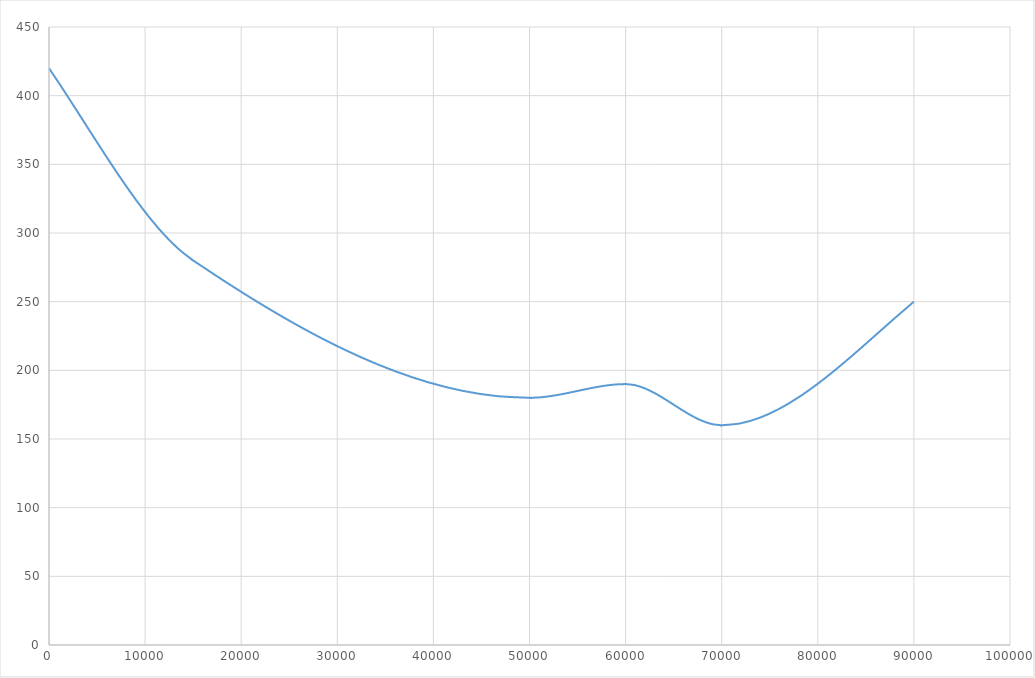
| Category | Series 0 |
|---|---|
| 0.0 | 420 |
| 1500.0 | 404.209 |
| 3000.0 | 387.935 |
| 4500.000000000001 | 371.51 |
| 6000.0 | 355.262 |
| 7500.0 | 339.523 |
| 9000.0 | 324.621 |
| 10500.0 | 310.888 |
| 11999.999999999998 | 298.654 |
| 13499.999999999998 | 288.248 |
| 14999.999999999998 | 280 |
| 15000.0 | 280 |
| 18500.0 | 263.86 |
| 22000.0 | 248.52 |
| 25500.0 | 234.191 |
| 29000.0 | 221.085 |
| 32500.0 | 209.414 |
| 36000.0 | 199.39 |
| 39500.0 | 191.225 |
| 43000.0 | 185.13 |
| 46500.0 | 181.318 |
| 49999.99999999999 | 180 |
| 50000.0 | 180 |
| 51000.0 | 180.28 |
| 52000.0 | 181.04 |
| 53000.0 | 182.16 |
| 54000.0 | 183.52 |
| 55000.0 | 185 |
| 56000.0 | 186.48 |
| 57000.0 | 187.84 |
| 58000.0 | 188.96 |
| 59000.0 | 189.72 |
| 60000.0 | 190 |
| 60000.0 | 190 |
| 61000.0 | 189.16 |
| 62000.0 | 186.88 |
| 63000.0 | 183.52 |
| 64000.0 | 179.44 |
| 65000.0 | 175 |
| 66000.0 | 170.56 |
| 67000.0 | 166.48 |
| 68000.0 | 163.12 |
| 69000.0 | 160.84 |
| 70000.0 | 160 |
| 70000.0 | 160 |
| 72000.0 | 161.459 |
| 74000.0 | 165.587 |
| 76000.0 | 172.013 |
| 78000.0 | 180.362 |
| 80000.0 | 190.264 |
| 82000.0 | 201.344 |
| 84000.0 | 213.23 |
| 86000.0 | 225.55 |
| 88000.0 | 237.931 |
| 90000.0 | 250 |